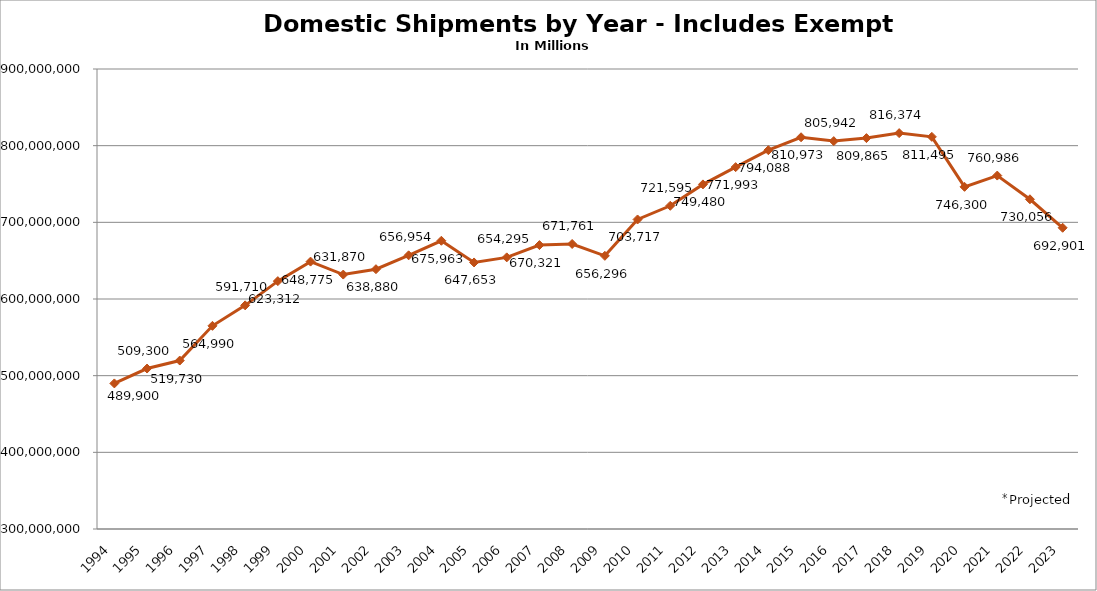
| Category | Series 0 |
|---|---|
| 1994 | 489900000 |
| 1995 | 509300000 |
| 1996 | 519730000 |
| 1997 | 564990000 |
| 1998 | 591710000 |
| 1999 | 623312000 |
| 2000 | 648775000 |
| 2001 | 631870000 |
| 2002 | 638880000 |
| 2003 | 656953556 |
| 2004 | 675963429 |
| 2005 | 647653438 |
| 2006 | 654295090.279 |
| 2007 | 670320908.747 |
| 2008 | 671760569.61 |
| 2009 | 656296449.81 |
| 2010 | 703716570.51 |
| 2011 | 721594535.57 |
| 2012 | 749479653 |
| 2013 | 771993455.99 |
| 2014 | 794087706.91 |
| 2015 | 810973172 |
| 2016 | 805942429.818 |
| 2017 | 809865466.727 |
| 2018 | 816374282.45 |
| 2019 | 811494774 |
| 2020 | 746300000 |
| 2021 | 760986000 |
| 2022 | 730056000 |
| 2023 | 692901000 |